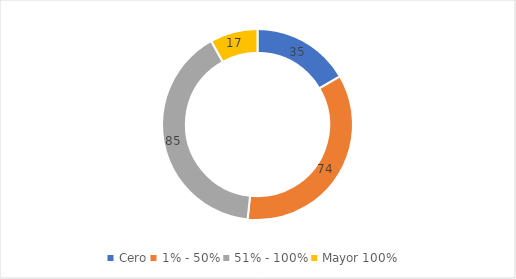
| Category | CANTIDAD |
|---|---|
| Cero | 35 |
| 1% - 50% | 74 |
| 51% - 100% | 85 |
| Mayor 100% | 17 |